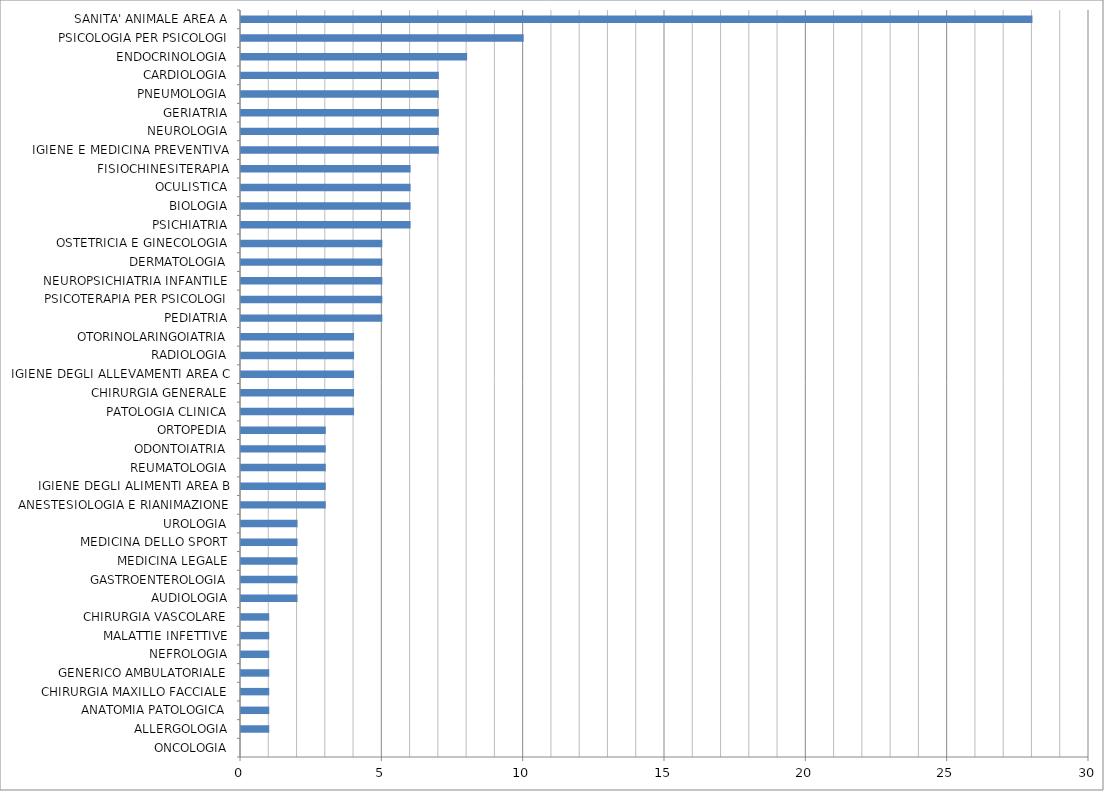
| Category | Series 0 |
|---|---|
| ONCOLOGIA | 0 |
| ALLERGOLOGIA | 1 |
| ANATOMIA PATOLOGICA | 1 |
| CHIRURGIA MAXILLO FACCIALE | 1 |
| GENERICO AMBULATORIALE | 1 |
| NEFROLOGIA | 1 |
| MALATTIE INFETTIVE | 1 |
| CHIRURGIA VASCOLARE | 1 |
| AUDIOLOGIA | 2 |
| GASTROENTEROLOGIA | 2 |
| MEDICINA LEGALE | 2 |
| MEDICINA DELLO SPORT | 2 |
| UROLOGIA | 2 |
| ANESTESIOLOGIA E RIANIMAZIONE | 3 |
| IGIENE DEGLI ALIMENTI AREA B | 3 |
| REUMATOLOGIA | 3 |
| ODONTOIATRIA | 3 |
| ORTOPEDIA | 3 |
| PATOLOGIA CLINICA | 4 |
| CHIRURGIA GENERALE | 4 |
| IGIENE DEGLI ALLEVAMENTI AREA C | 4 |
| RADIOLOGIA | 4 |
| OTORINOLARINGOIATRIA | 4 |
| PEDIATRIA | 5 |
| PSICOTERAPIA PER PSICOLOGI | 5 |
| NEUROPSICHIATRIA INFANTILE | 5 |
| DERMATOLOGIA | 5 |
| OSTETRICIA E GINECOLOGIA | 5 |
| PSICHIATRIA | 6 |
| BIOLOGIA | 6 |
| OCULISTICA | 6 |
| FISIOCHINESITERAPIA | 6 |
| IGIENE E MEDICINA PREVENTIVA | 7 |
| NEUROLOGIA | 7 |
| GERIATRIA | 7 |
| PNEUMOLOGIA | 7 |
| CARDIOLOGIA | 7 |
| ENDOCRINOLOGIA | 8 |
| PSICOLOGIA PER PSICOLOGI | 10 |
| SANITA' ANIMALE AREA A | 28 |